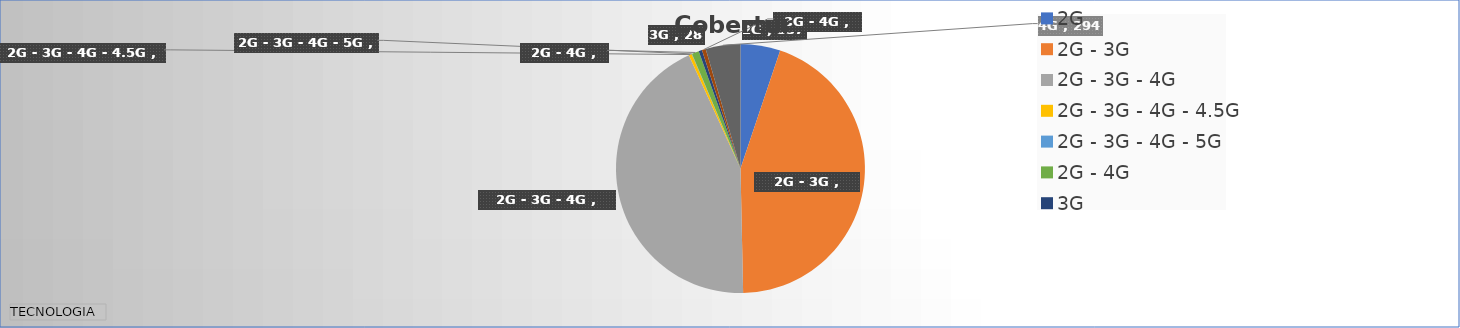
| Category | Total |
|---|---|
| 2G  | 337 |
| 2G - 3G  | 2903 |
| 2G - 3G - 4G  | 2840 |
| 2G - 3G - 4G - 4.5G  | 26 |
| 2G - 3G - 4G - 5G  | 2 |
| 2G - 4G  | 61 |
| 3G  | 28 |
| 3G - 4G  | 33 |
| 4G  | 294 |